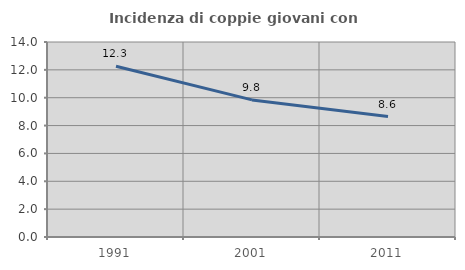
| Category | Incidenza di coppie giovani con figli |
|---|---|
| 1991.0 | 12.258 |
| 2001.0 | 9.843 |
| 2011.0 | 8.647 |